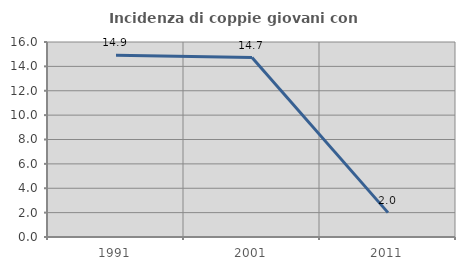
| Category | Incidenza di coppie giovani con figli |
|---|---|
| 1991.0 | 14.907 |
| 2001.0 | 14.724 |
| 2011.0 | 2 |